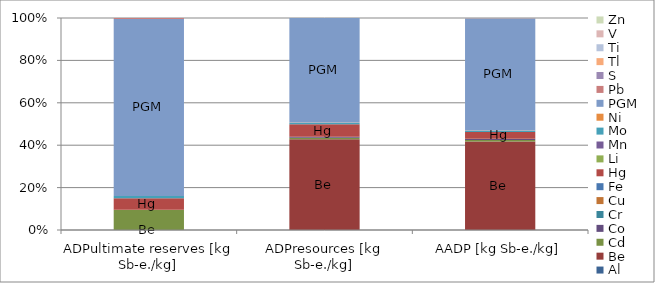
| Category | Al | Be | Cd | Co | Cr | Cu | Fe | Hg | Li | Mn | Mo | Ni | PGM | Pb | S | Tl | Ti | V | Zn |
|---|---|---|---|---|---|---|---|---|---|---|---|---|---|---|---|---|---|---|---|
| ADPultimate reserves [kg Sb-e./kg] | 0 | 0 | 0.157 | 0 | 0 | 0.001 | 0 | 0.092 | 0 | 0 | 0.018 | 0 | 1.396 | 0.006 | 0 | 0 | 0 | 0 | 0.001 |
| ADPresources [kg Sb-e./kg] | 0 | 5.706 | 0.087 | 0.068 | 0 | 0 | 0 | 0.784 | 0.003 | 0.001 | 0.093 | 0.016 | 6.559 | 0 | 0 | 0.003 | 0 | 0.002 | 0 |
| AADP [kg Sb-e./kg] | 0 | 17.216 | 0.272 | 0.227 | 0 | 0.001 | 0 | 1.337 | 0.009 | 0.003 | 0.246 | 0.038 | 21.841 | 0.001 | 0.001 | 0.014 | 0.001 | 0.009 | 0.001 |